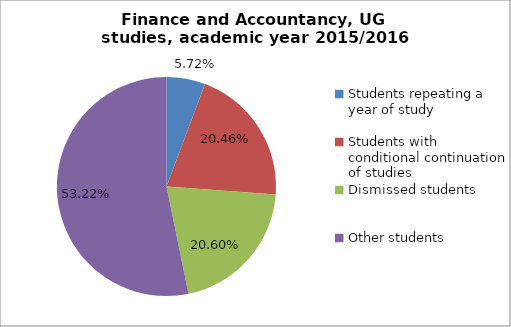
| Category | Series 0 |
|---|---|
| Students repeating a year of study | 40 |
| Students with conditional continuation of studies | 143 |
| Dismissed students | 144 |
| Other students | 372 |